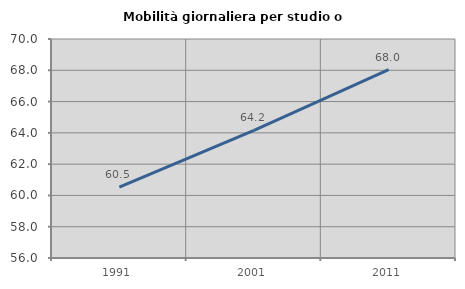
| Category | Mobilità giornaliera per studio o lavoro |
|---|---|
| 1991.0 | 60.533 |
| 2001.0 | 64.161 |
| 2011.0 | 68.037 |